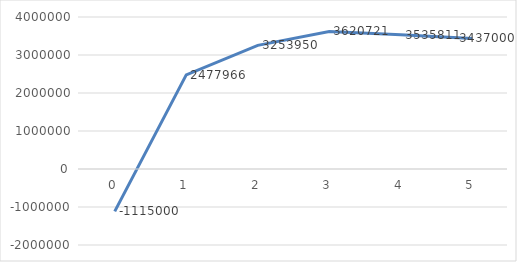
| Category | Series 0 |
|---|---|
| 0.0 | -1115000 |
| 1.0 | 2477966.102 |
| 2.0 | 3253950.014 |
| 3.0 | 3620720.716 |
| 4.0 | 3535811.139 |
| 5.0 | 3436999.558 |